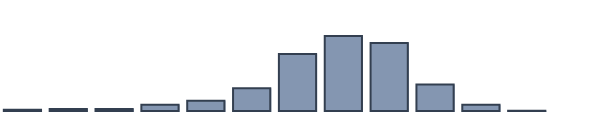
| Category | Series 0 |
|---|---|
| 0 | 0.478 |
| 1 | 0.696 |
| 2 | 0.696 |
| 3 | 2.261 |
| 4 | 3.696 |
| 5 | 8.174 |
| 6 | 20.565 |
| 7 | 27 |
| 8 | 24.522 |
| 9 | 9.565 |
| 10 | 2.261 |
| 11 | 0.087 |
| 12 | 0 |